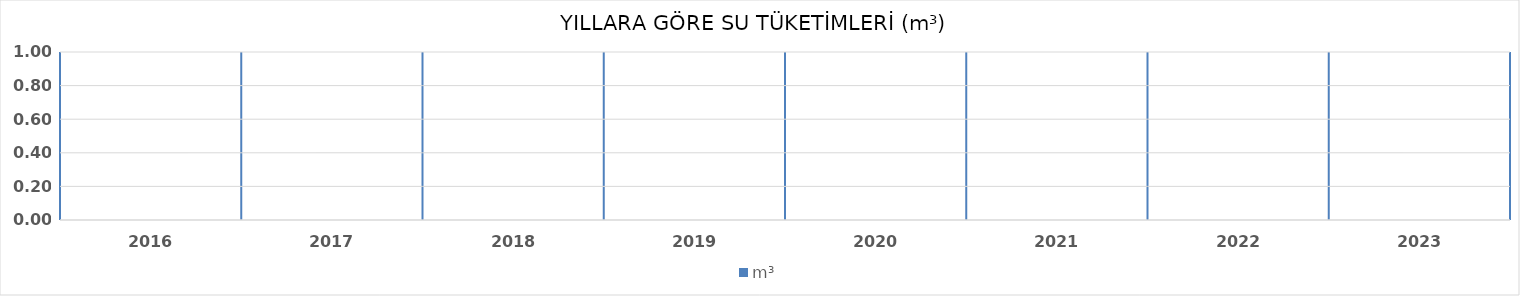
| Category | m³ |
|---|---|
| 2016.0 | 0 |
| 2017.0 | 0 |
| 2018.0 | 0 |
| 2019.0 | 0 |
| 2020.0 | 0 |
| 2021.0 | 0 |
| 2022.0 | 0 |
| 2023.0 | 0 |